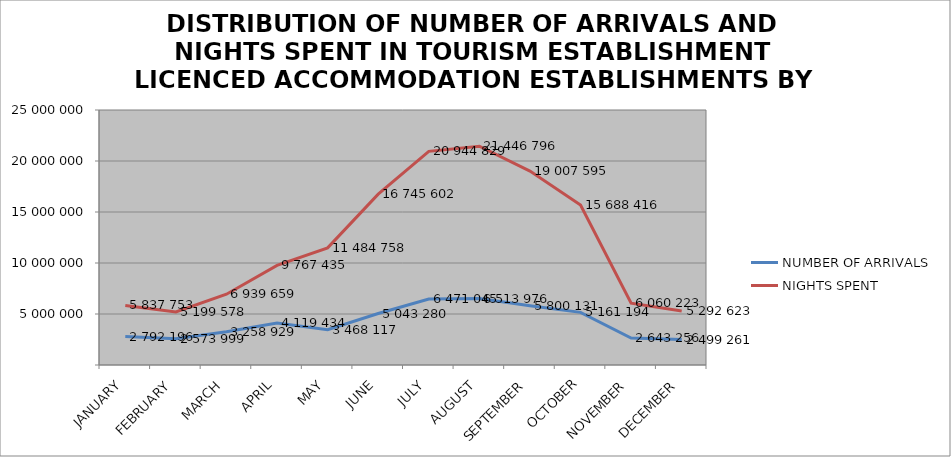
| Category | NUMBER OF ARRIVALS | NIGHTS SPENT |
|---|---|---|
| JANUARY | 2792196 | 5837753 |
| FEBRUARY | 2573999 | 5199578 |
| MARCH | 3258929 | 6939659 |
| APRIL | 4119434 | 9767435 |
| MAY | 3468117 | 11484758 |
| JUNE | 5043280 | 16745602 |
| JULY | 6471045 | 20944829 |
| AUGUST | 6513976 | 21446796 |
| SEPTEMBER | 5800131 | 19007595 |
| OCTOBER | 5161194 | 15688416 |
| NOVEMBER | 2643256 | 6060223 |
| DECEMBER | 2499261 | 5292623 |